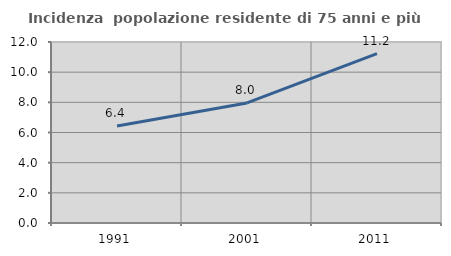
| Category | Incidenza  popolazione residente di 75 anni e più |
|---|---|
| 1991.0 | 6.43 |
| 2001.0 | 7.96 |
| 2011.0 | 11.226 |